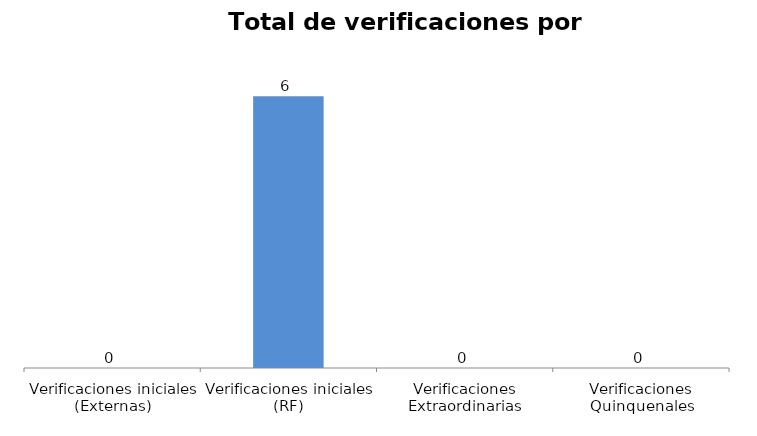
| Category | Series 1 |
|---|---|
| Verificaciones iniciales (Externas) | 0 |
| Verificaciones iniciales (RF) | 6 |
| Verificaciones Extraordinarias | 0 |
| Verificaciones Quinquenales | 0 |